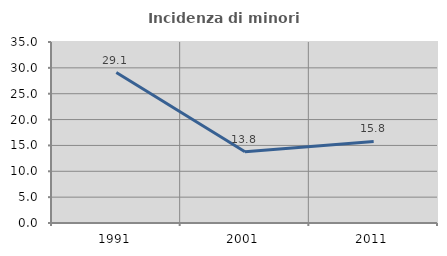
| Category | Incidenza di minori stranieri |
|---|---|
| 1991.0 | 29.091 |
| 2001.0 | 13.793 |
| 2011.0 | 15.764 |